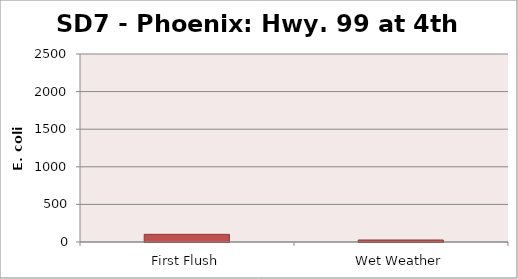
| Category | E. coli MPN - |
|---|---|
| First Flush | 101.7 |
| Wet Weather | 26.5 |